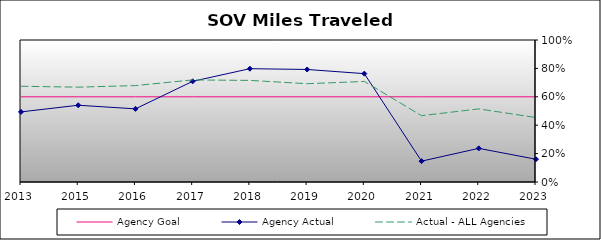
| Category | Agency Goal | Agency Actual | Actual - ALL Agencies |
|---|---|---|---|
| 2013.0 | 0.6 | 0.494 | 0.674 |
| 2015.0 | 0.6 | 0.54 | 0.668 |
| 2016.0 | 0.6 | 0.515 | 0.679 |
| 2017.0 | 0.6 | 0.709 | 0.719 |
| 2018.0 | 0.6 | 0.798 | 0.715 |
| 2019.0 | 0.6 | 0.792 | 0.692 |
| 2020.0 | 0.6 | 0.763 | 0.708 |
| 2021.0 | 0.6 | 0.147 | 0.467 |
| 2022.0 | 0.6 | 0.237 | 0.515 |
| 2023.0 | 0.6 | 0.16 | 0.454 |